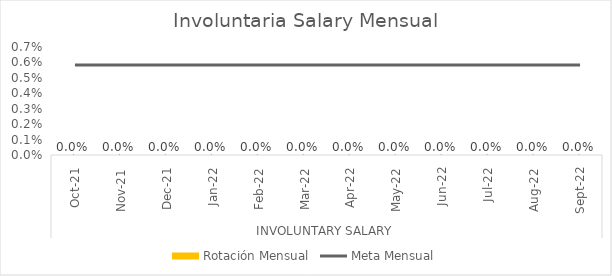
| Category | Series 6 | Rotación Mensual | Series 4 | Series 5 |
|---|---|---|---|---|
| 0 |  | 0 |  |  |
| 1 |  | 0 |  |  |
| 2 |  | 0 |  |  |
| 3 |  | 0 |  |  |
| 4 |  | 0 |  |  |
| 5 |  | 0 |  |  |
| 6 |  | 0 |  |  |
| 7 |  | 0 |  |  |
| 8 |  | 0 |  |  |
| 9 |  | 0 |  |  |
| 10 |  | 0 |  |  |
| 11 |  | 0 |  |  |